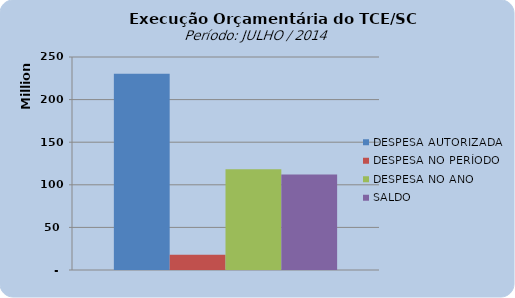
| Category | DESPESA AUTORIZADA | DESPESA NO PERÍODO | DESPESA NO ANO | SALDO |
|---|---|---|---|---|
| 0 | 230208185.06 | 17897246.49 | 118232364.05 | 111975821.01 |